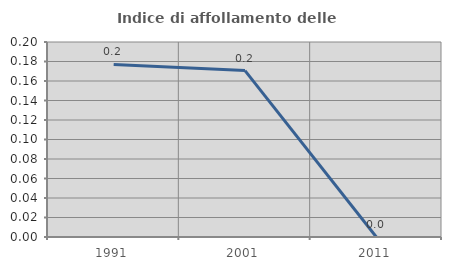
| Category | Indice di affollamento delle abitazioni  |
|---|---|
| 1991.0 | 0.177 |
| 2001.0 | 0.171 |
| 2011.0 | 0 |